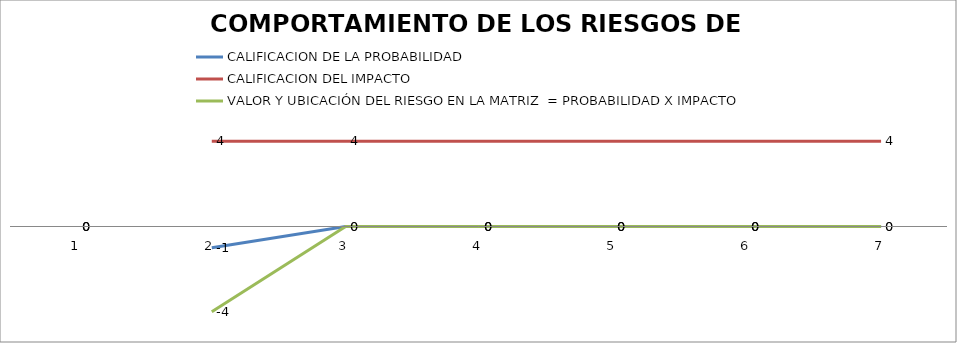
| Category | CALIFICACION DE LA PROBABILIDAD  | CALIFICACION DEL IMPACTO  | VALOR Y UBICACIÓN DEL RIESGO EN LA MATRIZ  = PROBABILIDAD X IMPACTO  |
|---|---|---|---|
| 0 | 0 | 0 | 0 |
| 1 | -1 | 4 | -4 |
| 2 | 0 | 4 | 0 |
| 3 | 0 | 0 | 0 |
| 4 | 0 | 0 | 0 |
| 5 | 0 | 0 | 0 |
| 6 | 0 | 4 | 0 |